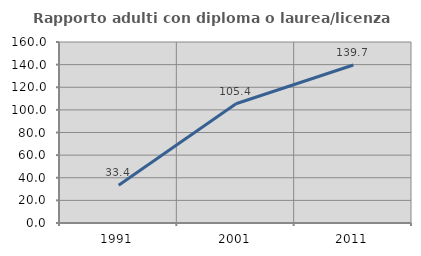
| Category | Rapporto adulti con diploma o laurea/licenza media  |
|---|---|
| 1991.0 | 33.392 |
| 2001.0 | 105.415 |
| 2011.0 | 139.7 |